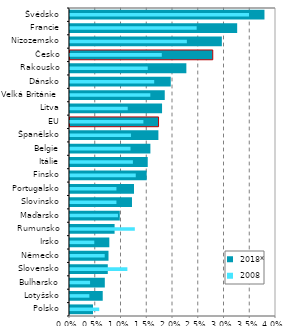
| Category |  2018* |
|---|---|
| Polsko | 0.005 |
| Lotyšsko | 0.007 |
| Bulharsko | 0.007 |
| Slovensko | 0.008 |
| Německo | 0.008 |
| Irsko | 0.008 |
| Rumunsko | 0.009 |
| Maďarsko | 0.01 |
| Slovinsko | 0.012 |
| Portugalsko | 0.013 |
| Finsko | 0.015 |
| Itálie | 0.015 |
| Belgie | 0.016 |
| Španělsko | 0.017 |
| EU | 0.017 |
| Litva | 0.018 |
| Velká Británie  | 0.019 |
| Dánsko | 0.02 |
| Rakousko | 0.023 |
| Česko | 0.028 |
| Nizozemsko | 0.03 |
| Francie | 0.033 |
| Švédsko | 0.038 |